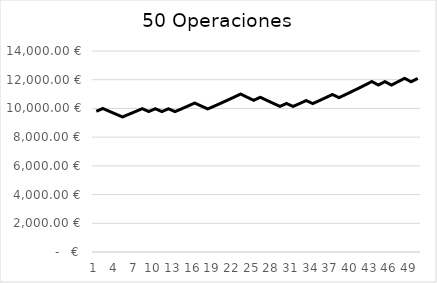
| Category | Series 0 |
|---|---|
| 0 | 9800 |
| 1 | 9996 |
| 2 | 9796.08 |
| 3 | 9600.158 |
| 4 | 9408.155 |
| 5 | 9596.318 |
| 6 | 9788.245 |
| 7 | 9984.01 |
| 8 | 9784.329 |
| 9 | 9980.016 |
| 10 | 9780.416 |
| 11 | 9976.024 |
| 12 | 9776.504 |
| 13 | 9972.034 |
| 14 | 10171.474 |
| 15 | 10374.904 |
| 16 | 10167.406 |
| 17 | 9964.058 |
| 18 | 10163.339 |
| 19 | 10366.605 |
| 20 | 10573.938 |
| 21 | 10785.416 |
| 22 | 11001.125 |
| 23 | 10781.102 |
| 24 | 10565.48 |
| 25 | 10776.79 |
| 26 | 10561.254 |
| 27 | 10350.029 |
| 28 | 10143.028 |
| 29 | 10345.889 |
| 30 | 10138.971 |
| 31 | 10341.75 |
| 32 | 10548.585 |
| 33 | 10337.614 |
| 34 | 10544.366 |
| 35 | 10755.253 |
| 36 | 10970.358 |
| 37 | 10750.951 |
| 38 | 10965.97 |
| 39 | 11185.29 |
| 40 | 11408.996 |
| 41 | 11637.175 |
| 42 | 11869.919 |
| 43 | 11632.521 |
| 44 | 11865.171 |
| 45 | 11627.868 |
| 46 | 11860.425 |
| 47 | 12097.633 |
| 48 | 11855.681 |
| 49 | 12092.794 |